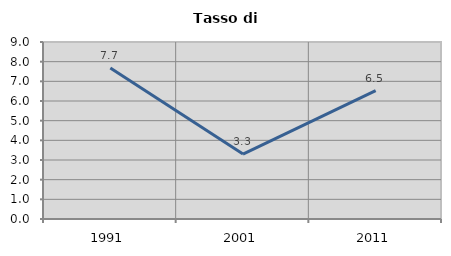
| Category | Tasso di disoccupazione   |
|---|---|
| 1991.0 | 7.677 |
| 2001.0 | 3.3 |
| 2011.0 | 6.528 |